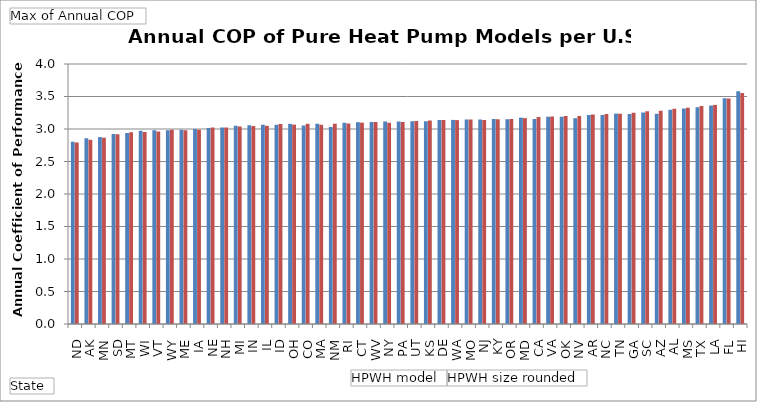
| Category | Pure heat pump - 40 | Pure heat pump - 80 |
|---|---|---|
| ND | 2.802 | 2.793 |
| AK | 2.856 | 2.834 |
| MN | 2.876 | 2.866 |
| SD | 2.922 | 2.919 |
| MT | 2.94 | 2.95 |
| WI | 2.972 | 2.955 |
| VT | 2.982 | 2.961 |
| WY | 2.981 | 2.989 |
| ME | 2.989 | 2.982 |
| IA | 3 | 2.989 |
| NE | 3.017 | 3.022 |
| NH | 3.024 | 3.022 |
| MI | 3.048 | 3.037 |
| IN | 3.059 | 3.048 |
| IL | 3.064 | 3.049 |
| ID | 3.064 | 3.077 |
| OH | 3.079 | 3.067 |
| CO | 3.052 | 3.079 |
| MA | 3.08 | 3.065 |
| NM | 3.032 | 3.081 |
| RI | 3.096 | 3.084 |
| CT | 3.105 | 3.098 |
| WV | 3.109 | 3.108 |
| NY | 3.115 | 3.096 |
| PA | 3.115 | 3.108 |
| UT | 3.118 | 3.122 |
| KS | 3.121 | 3.13 |
| DE | 3.139 | 3.137 |
| WA | 3.14 | 3.137 |
| MO | 3.145 | 3.146 |
| NJ | 3.147 | 3.139 |
| KY | 3.154 | 3.151 |
| OR | 3.149 | 3.154 |
| MD | 3.175 | 3.168 |
| CA | 3.152 | 3.185 |
| VA | 3.189 | 3.194 |
| OK | 3.19 | 3.199 |
| NV | 3.166 | 3.2 |
| AR | 3.215 | 3.224 |
| NC | 3.216 | 3.232 |
| TN | 3.237 | 3.235 |
| GA | 3.231 | 3.252 |
| SC | 3.253 | 3.272 |
| AZ | 3.233 | 3.281 |
| AL | 3.298 | 3.311 |
| MS | 3.314 | 3.329 |
| TX | 3.335 | 3.354 |
| LA | 3.361 | 3.37 |
| FL | 3.472 | 3.469 |
| HI | 3.579 | 3.556 |